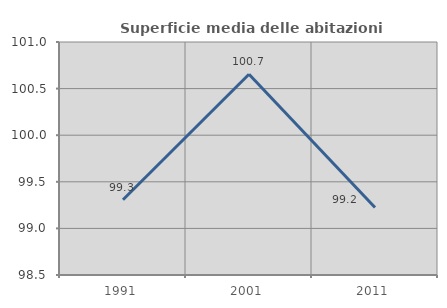
| Category | Superficie media delle abitazioni occupate |
|---|---|
| 1991.0 | 99.308 |
| 2001.0 | 100.654 |
| 2011.0 | 99.224 |